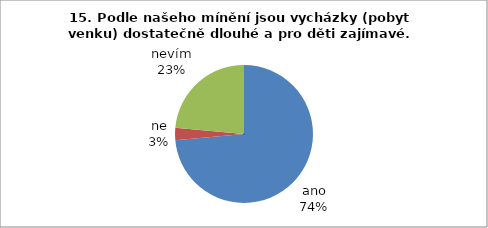
| Category | 15. |
|---|---|
| ano | 25 |
| ne | 1 |
| nevím | 8 |